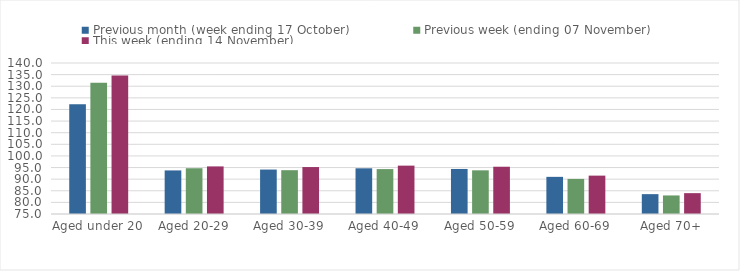
| Category | Previous month (week ending 17 October) | Previous week (ending 07 November) | This week (ending 14 November) |
|---|---|---|---|
| Aged under 20 | 122.21 | 131.54 | 134.64 |
| Aged 20-29 | 93.76 | 94.7 | 95.49 |
| Aged 30-39 | 94.13 | 93.86 | 95.21 |
| Aged 40-49 | 94.67 | 94.33 | 95.82 |
| Aged 50-59 | 94.39 | 93.8 | 95.35 |
| Aged 60-69 | 90.99 | 90.11 | 91.52 |
| Aged 70+ | 83.55 | 82.99 | 83.98 |